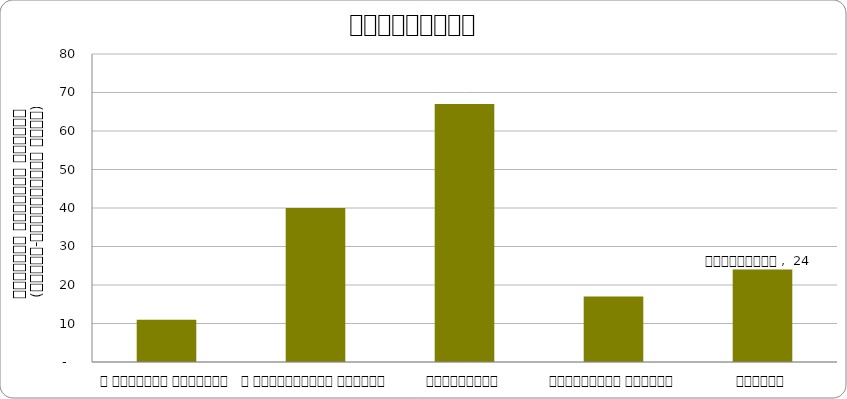
| Category | स्वास्थ्य  |
|---|---|
| द हिमालयन टाइम्स् | 11 |
| द काठमाण्डौं पोस्ट् | 40 |
| कान्तिपुर | 67 |
| अन्नपूर्ण पोस्ट् | 17 |
| नागरिक | 24 |